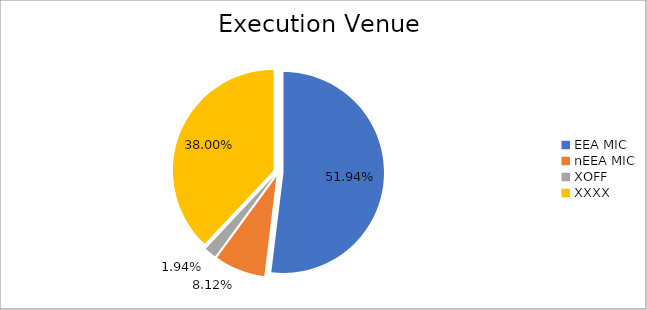
| Category | Series 0 |
|---|---|
| EEA MIC | 5680149.521 |
| nEEA MIC | 888502.224 |
| XOFF | 211729.18 |
| XXXX | 4155927.378 |